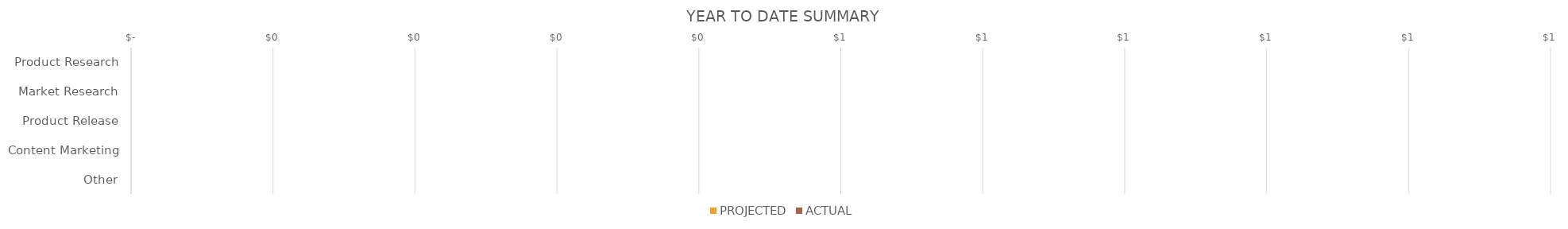
| Category | PROJECTED | ACTUAL |
|---|---|---|
| Product Research | 0 | 0 |
| Market Research | 0 | 0 |
| Product Release | 0 | 0 |
| Content Marketing | 0 | 0 |
| Other | 0 | 0 |